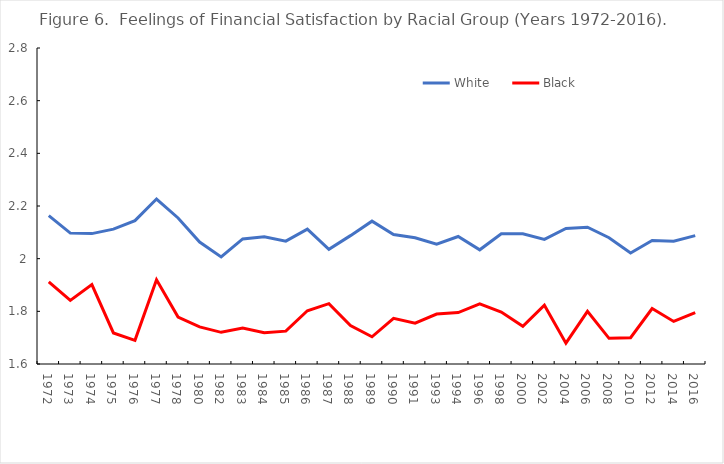
| Category | White | Black |
|---|---|---|
| 1972.0 | 2.164 | 1.912 |
| 1973.0 | 2.097 | 1.842 |
| 1974.0 | 2.095 | 1.902 |
| 1975.0 | 2.112 | 1.718 |
| 1976.0 | 2.144 | 1.69 |
| 1977.0 | 2.226 | 1.92 |
| 1978.0 | 2.155 | 1.778 |
| 1980.0 | 2.063 | 1.741 |
| 1982.0 | 2.006 | 1.72 |
| 1983.0 | 2.075 | 1.736 |
| 1984.0 | 2.083 | 1.719 |
| 1985.0 | 2.067 | 1.725 |
| 1986.0 | 2.112 | 1.802 |
| 1987.0 | 2.036 | 1.829 |
| 1988.0 | 2.087 | 1.746 |
| 1989.0 | 2.142 | 1.703 |
| 1990.0 | 2.092 | 1.774 |
| 1991.0 | 2.079 | 1.755 |
| 1993.0 | 2.055 | 1.79 |
| 1994.0 | 2.084 | 1.795 |
| 1996.0 | 2.034 | 1.828 |
| 1998.0 | 2.094 | 1.798 |
| 2000.0 | 2.095 | 1.743 |
| 2002.0 | 2.073 | 1.823 |
| 2004.0 | 2.115 | 1.679 |
| 2006.0 | 2.119 | 1.8 |
| 2008.0 | 2.08 | 1.698 |
| 2010.0 | 2.021 | 1.7 |
| 2012.0 | 2.069 | 1.811 |
| 2014.0 | 2.066 | 1.762 |
| 2016.0 | 2.087 | 1.796 |